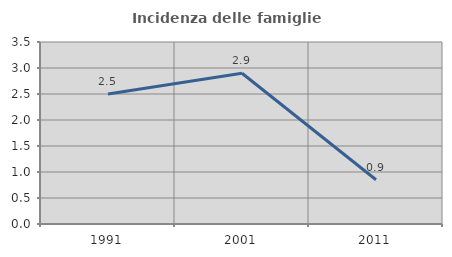
| Category | Incidenza delle famiglie numerose |
|---|---|
| 1991.0 | 2.5 |
| 2001.0 | 2.899 |
| 2011.0 | 0.851 |